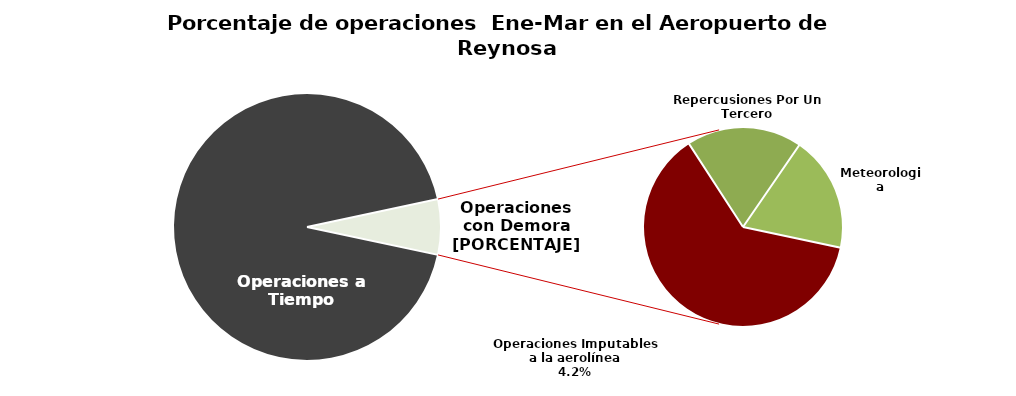
| Category | Series 0 |
|---|---|
| Operaciones a Tiempo | 670 |
| Operaciones Imputables a la aerolínea | 30 |
| Repercusiones Por Un Tercero | 9 |
| Meteorologia | 9 |